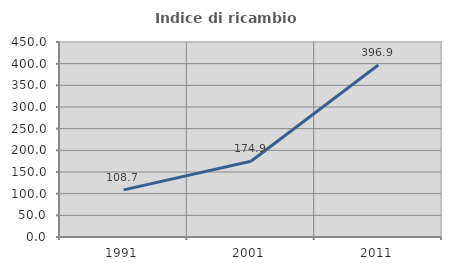
| Category | Indice di ricambio occupazionale  |
|---|---|
| 1991.0 | 108.683 |
| 2001.0 | 174.912 |
| 2011.0 | 396.875 |